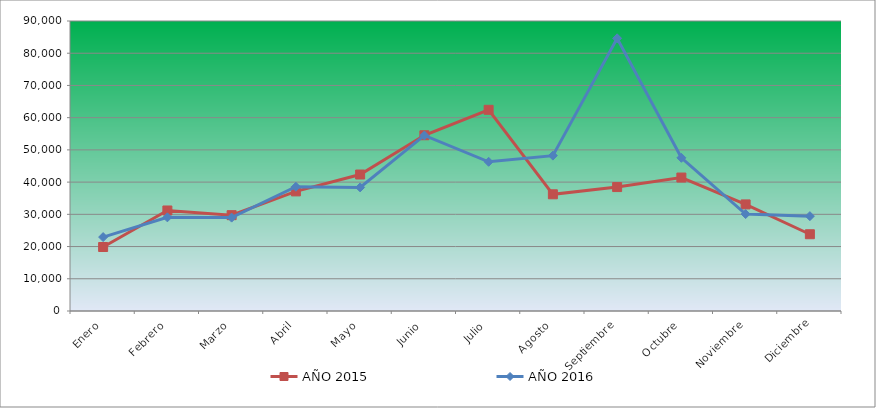
| Category | AÑO 2015 | AÑO 2016 |
|---|---|---|
| Enero | 19860 | 22940 |
| Febrero | 31195 | 29060 |
| Marzo | 29740 | 28980 |
| Abril | 37120 | 38560 |
| Mayo | 42360 | 38360 |
| Junio | 54540 | 54480 |
| Julio | 62440 | 46300 |
| Agosto | 36220 | 48220 |
| Septiembre | 38460 | 84620 |
| Octubre | 41420 | 47540 |
| Noviembre | 33080 | 30080 |
| Diciembre | 23820 | 29440 |